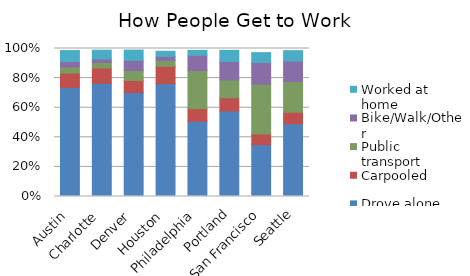
| Category | Drove alone | Carpooled | Public transport | Bike/Walk/Other | Worked at home |
|---|---|---|---|---|---|
| Austin | 0.737 | 0.097 | 0.04 | 0.037 | 0.074 |
| Charlotte | 0.765 | 0.104 | 0.037 | 0.024 | 0.059 |
| Denver | 0.702 | 0.082 | 0.068 | 0.068 | 0.069 |
| Houston | 0.763 | 0.117 | 0.04 | 0.026 | 0.035 |
| Philadelphia | 0.508 | 0.086 | 0.257 | 0.103 | 0.033 |
| Portland | 0.578 | 0.089 | 0.121 | 0.125 | 0.075 |
| San Francisco | 0.35 | 0.072 | 0.336 | 0.147 | 0.066 |
| Seattle | 0.492 | 0.077 | 0.208 | 0.138 | 0.07 |